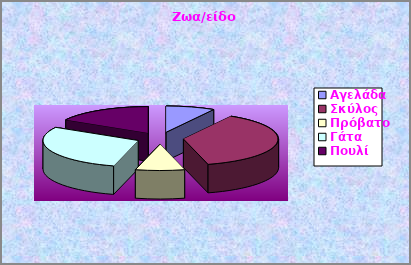
| Category | Ζωα/είδος | Σύνολο ποδιών |
|---|---|---|
| Αγελάδα | 2 | 8 |
| Σκύλος  | 9 | 36 |
| Πρόβατο | 2 | 8 |
| Γάτα | 7 | 28 |
| Πουλί | 4 | 8 |